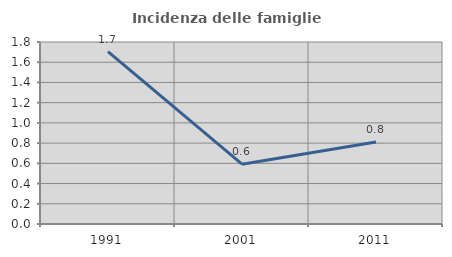
| Category | Incidenza delle famiglie numerose |
|---|---|
| 1991.0 | 1.705 |
| 2001.0 | 0.591 |
| 2011.0 | 0.811 |